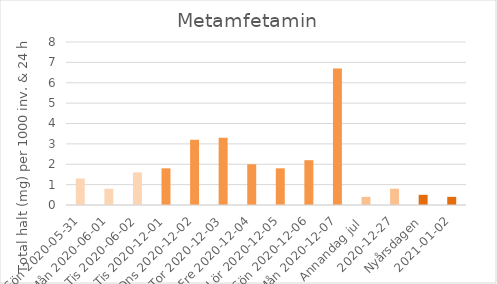
| Category | Metamfetamin |
|---|---|
| Sön 2020-05-31 | 1.3 |
| Mån 2020-06-01 | 0.8 |
|  Tis 2020-06-02 | 1.6 |
| Tis 2020-12-01 | 1.8 |
| Ons 2020-12-02 | 3.2 |
| Tor 2020-12-03 | 3.3 |
| Fre 2020-12-04 | 2 |
| Lör 2020-12-05 | 1.8 |
| Sön 2020-12-06 | 2.2 |
| Mån 2020-12-07 | 6.7 |
| Annandag jul  | 0.4 |
| 2020-12-27 | 0.8 |
| Nyårsdagen | 0.5 |
| 2021-01-02 | 0.4 |